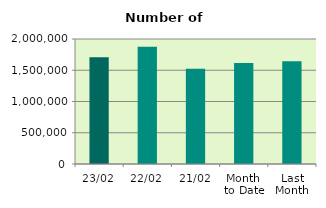
| Category | Series 0 |
|---|---|
| 23/02 | 1707846 |
| 22/02 | 1874126 |
| 21/02 | 1524786 |
| Month 
to Date | 1615140 |
| Last
Month | 1644892 |